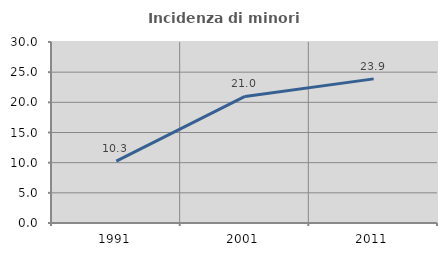
| Category | Incidenza di minori stranieri |
|---|---|
| 1991.0 | 10.256 |
| 2001.0 | 20.979 |
| 2011.0 | 23.89 |